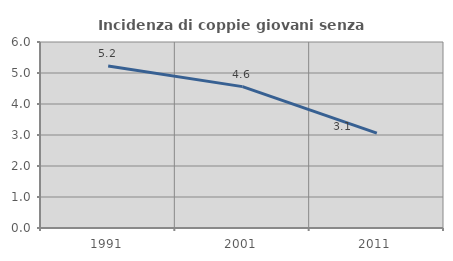
| Category | Incidenza di coppie giovani senza figli |
|---|---|
| 1991.0 | 5.226 |
| 2001.0 | 4.561 |
| 2011.0 | 3.061 |